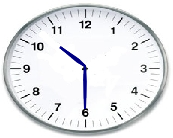
| Category | Series 0 |
|---|---|
| 0.0 | 0 |
| -0.19965887751182315 | 0.15 |
| -0.6363961030678927 | 0.636 |
| -0.1504537557880121 | 0.2 |
| 0.0 | 0 |
| -0.188677395055693 | 0.164 |
| -0.6363961030678927 | 0.636 |
| -0.1640147572476268 | 0.189 |
| 0.0 | 0 |
| 0.017449748351250197 | -0.5 |
| -2.6646978894262485e-16 | -1.45 |
| 0.008726203218641565 | -0.5 |
| 0.0 | 0 |
| -0.01744974835125038 | -0.5 |
| -2.6646978894262485e-16 | -1.45 |
| -0.008726203218641749 | -0.5 |
| 0.0 | 0 |